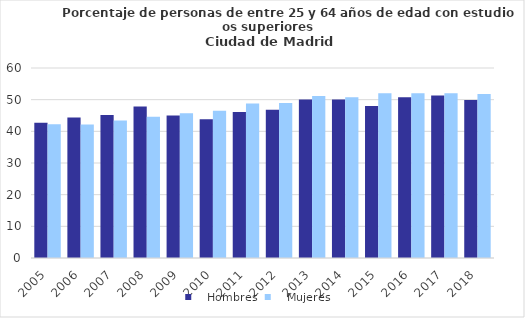
| Category |    Hombres |    Mujeres |
|---|---|---|
| 2005.0 | 42.725 | 42.23 |
| 2006.0 | 44.376 | 42.188 |
| 2007.0 | 45.173 | 43.455 |
| 2008.0 | 47.806 | 44.595 |
| 2009.0 | 45.02 | 45.678 |
| 2010.0 | 43.825 | 46.525 |
| 2011.0 | 46.12 | 48.786 |
| 2012.0 | 46.834 | 48.91 |
| 2013.0 | 50.043 | 51.173 |
| 2014.0 | 50.05 | 50.735 |
| 2015.0 | 48.012 | 52.02 |
| 2016.0 | 50.732 | 52.015 |
| 2017.0 | 51.312 | 52.015 |
| 2018.0 | 49.909 | 51.798 |